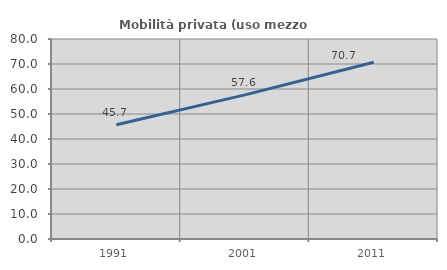
| Category | Mobilità privata (uso mezzo privato) |
|---|---|
| 1991.0 | 45.691 |
| 2001.0 | 57.638 |
| 2011.0 | 70.707 |